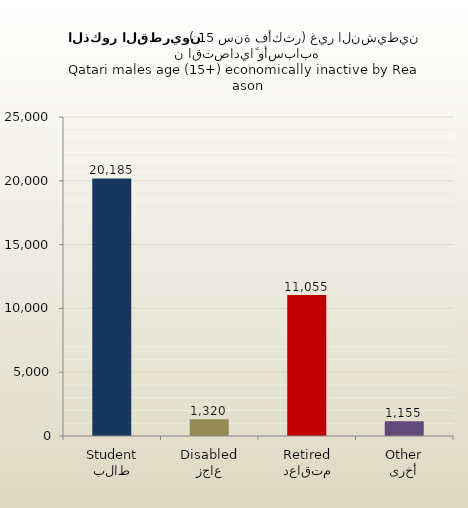
| Category | الذكور القطريين |
|---|---|
| طالب
Student | 20185 |
| عاجز
Disabled | 1320 |
| متقاعد
Retired | 11055 |
| أخرى
Other | 1155 |